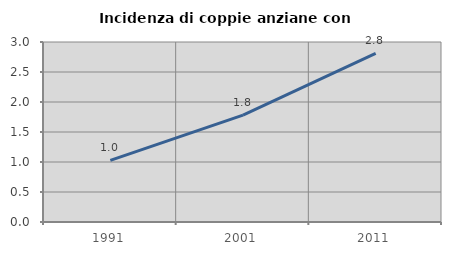
| Category | Incidenza di coppie anziane con figli |
|---|---|
| 1991.0 | 1.027 |
| 2001.0 | 1.781 |
| 2011.0 | 2.81 |